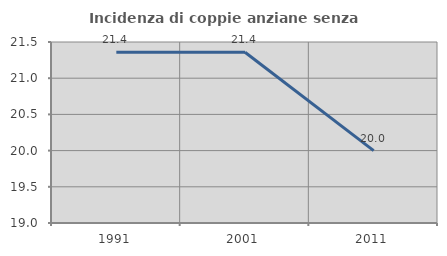
| Category | Incidenza di coppie anziane senza figli  |
|---|---|
| 1991.0 | 21.359 |
| 2001.0 | 21.359 |
| 2011.0 | 20 |